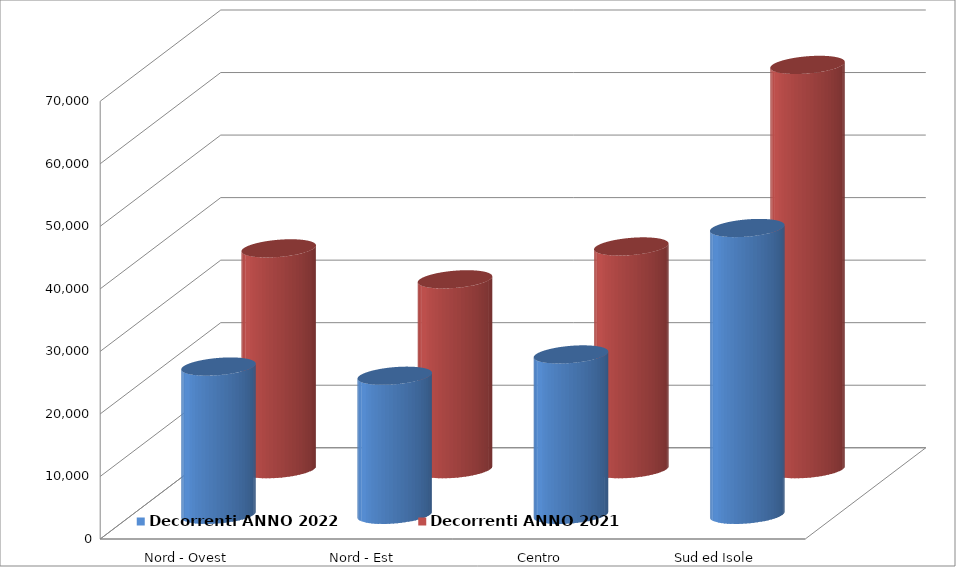
| Category | Decorrenti ANNO 2022 | Decorrenti ANNO 2021 |
|---|---|---|
| Nord - Ovest | 23708 | 35311 |
| Nord - Est | 22237 | 30361 |
| Centro | 25643 | 35616 |
| Sud ed Isole | 45860 | 64650 |